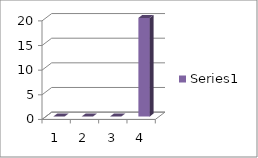
| Category | Series 0 |
|---|---|
| 0 | 0 |
| 1 | 0 |
| 2 | 0 |
| 3 | 20 |